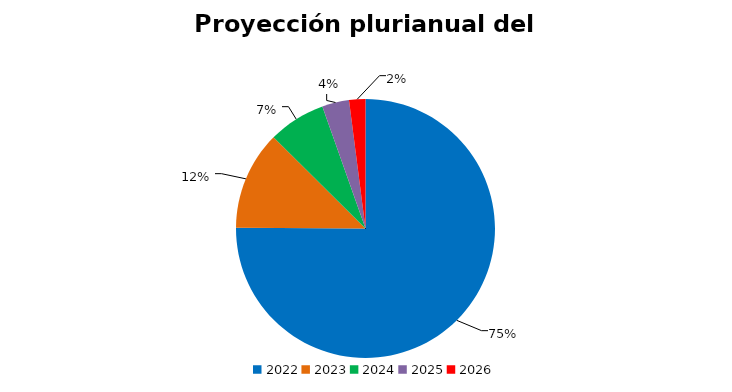
| Category | Monto uss |
|---|---|
| 2022.0 | 29586207.368 |
| 2023.0 | 4858691.338 |
| 2024.0 | 2823045.51 |
| 2025.0 | 1326745.778 |
| 2026.0 | 802636.431 |